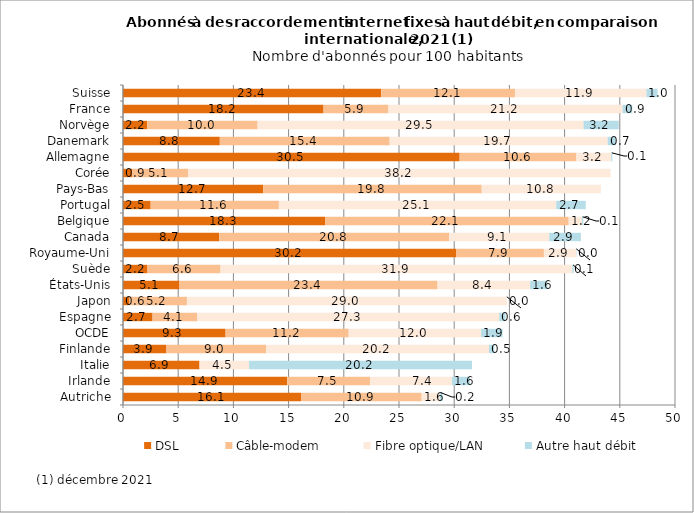
| Category | DSL  | Câble-modem | Fibre optique/LAN | Autre haut débit  |
|---|---|---|---|---|
| Autriche | 16.124 | 10.925 | 1.647 | 0.249 |
| Irlande | 14.871 | 7.511 | 7.411 | 1.63 |
| Italie | 6.932 | 0 | 4.488 | 20.193 |
| Finlande | 3.934 | 9.041 | 20.175 | 0.487 |
| OCDE | 9.292 | 11.153 | 11.991 | 1.946 |
| Espagne | 2.675 | 4.056 | 27.345 | 0.56 |
| Japon | 0.595 | 5.195 | 28.978 | 0.003 |
| États-Unis | 5.114 | 23.377 | 8.384 | 1.575 |
| Suède | 2.218 | 6.617 | 31.864 | 0.131 |
| Royaume-Uni | 30.196 | 7.93 | 2.912 | 0.038 |
| Canada | 8.705 | 20.844 | 9.056 | 2.872 |
| Belgique | 18.3 | 22.073 | 1.207 | 0.111 |
| Portugal | 2.506 | 11.615 | 25.118 | 2.675 |
| Pays-Bas | 12.713 | 19.779 | 10.796 | 0 |
| Corée | 0.856 | 5.06 | 38.249 | 0 |
| Allemagne | 30.494 | 10.579 | 3.152 | 0.103 |
| Danemark | 8.767 | 15.386 | 19.749 | 0.749 |
| Norvège | 2.188 | 10.003 | 29.521 | 3.197 |
| France | 18.166 | 5.878 | 21.212 | 0.874 |
| Suisse | 23.384 | 12.121 | 11.91 | 1.002 |